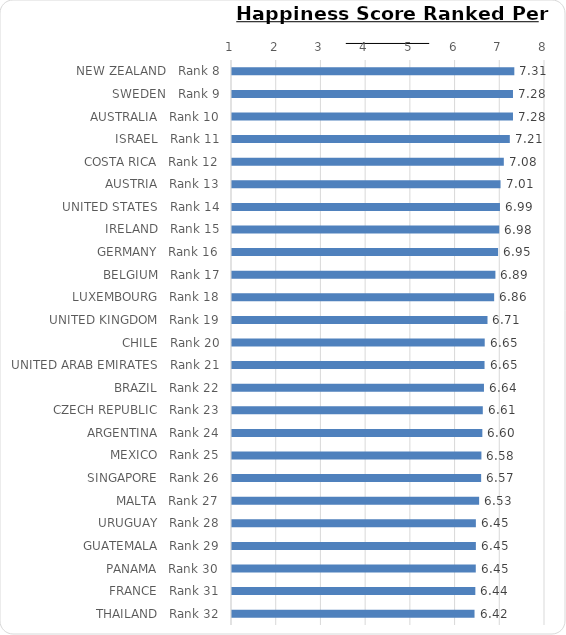
| Category | Happiness score |
|---|---|
| NEW ZEALAND   Rank 8 | 7.314 |
| SWEDEN   Rank 9 | 7.284 |
| AUSTRALIA   Rank 10 | 7.284 |
| ISRAEL   Rank 11 | 7.213 |
| COSTA RICA   Rank 12 | 7.079 |
| AUSTRIA   Rank 13 | 7.006 |
| UNITED STATES   Rank 14 | 6.993 |
| IRELAND   Rank 15 | 6.977 |
| GERMANY   Rank 16 | 6.951 |
| BELGIUM   Rank 17 | 6.891 |
| LUXEMBOURG   Rank 18 | 6.863 |
| UNITED KINGDOM   Rank 19 | 6.714 |
| CHILE   Rank 20 | 6.652 |
| UNITED ARAB EMIRATES   Rank 21 | 6.648 |
| BRAZIL   Rank 22 | 6.635 |
| CZECH REPUBLIC   Rank 23 | 6.609 |
| ARGENTINA   Rank 24 | 6.599 |
| MEXICO   Rank 25 | 6.578 |
| SINGAPORE   Rank 26 | 6.572 |
| MALTA   Rank 27 | 6.527 |
| URUGUAY   Rank 28 | 6.454 |
| GUATEMALA   Rank 29 | 6.454 |
| PANAMA   Rank 30 | 6.452 |
| FRANCE   Rank 31 | 6.442 |
| THAILAND   Rank 32 | 6.424 |